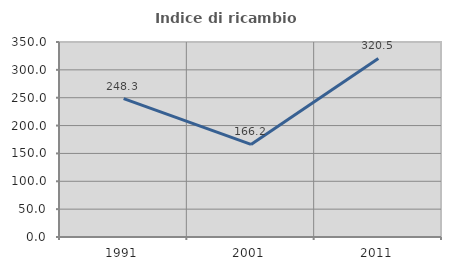
| Category | Indice di ricambio occupazionale  |
|---|---|
| 1991.0 | 248.333 |
| 2001.0 | 166.216 |
| 2011.0 | 320.455 |